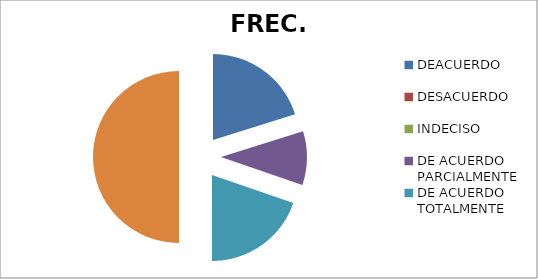
| Category | FREC. | % |
|---|---|---|
| DEACUERDO | 189 | 40 |
| DESACUERDO | 0 | 0 |
| INDECISO | 0 | 0 |
| DE ACUERDO PARCIALMENTE | 95 | 20 |
| DE ACUERDO TOTALMENTE | 185 | 40 |
| TOTAL | 469 | 1 |